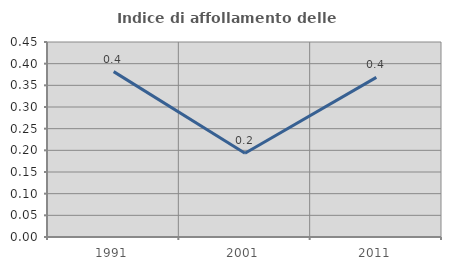
| Category | Indice di affollamento delle abitazioni  |
|---|---|
| 1991.0 | 0.382 |
| 2001.0 | 0.193 |
| 2011.0 | 0.368 |